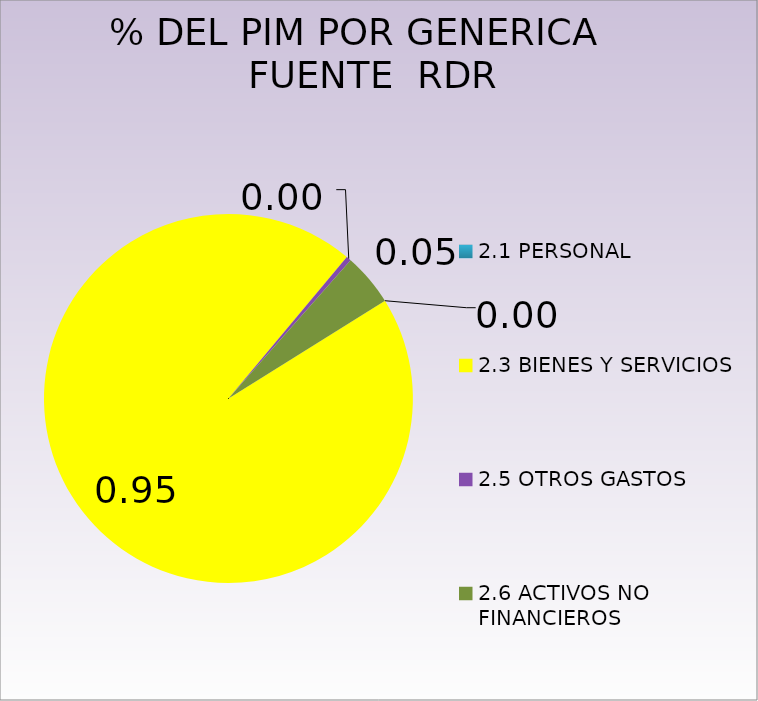
| Category | Series 0 |
|---|---|
| 2.1 PERSONAL | 0 |
| 2.3 BIENES Y SERVICIOS | 7125812 |
| 2.5 OTROS GASTOS  | 31913 |
| 2.6 ACTIVOS NO FINANCIEROS  | 345250 |